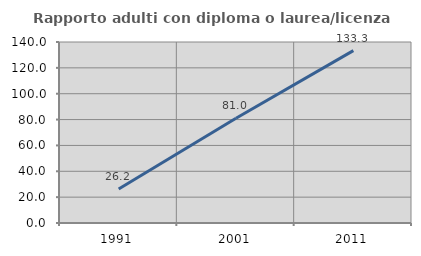
| Category | Rapporto adulti con diploma o laurea/licenza media  |
|---|---|
| 1991.0 | 26.246 |
| 2001.0 | 80.978 |
| 2011.0 | 133.333 |